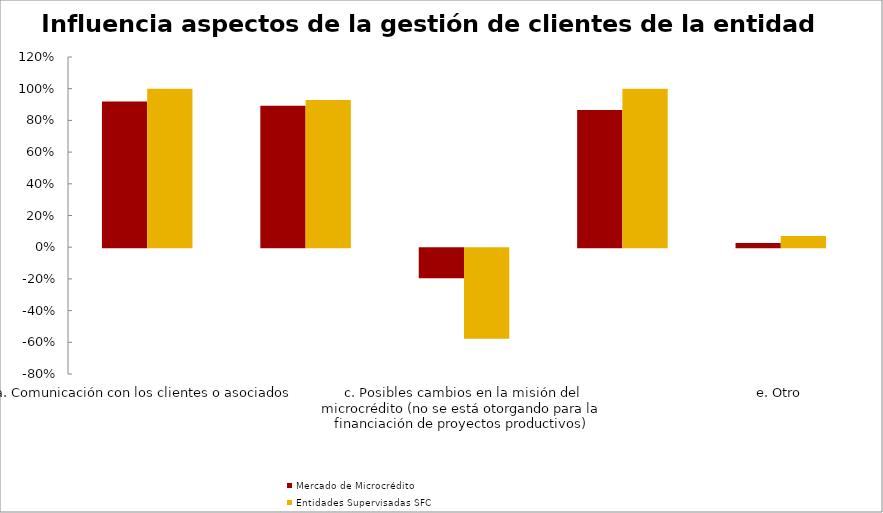
| Category | Mercado de Microcrédito | Entidades Supervisadas SFC |
|---|---|---|
| a. Comunicación con los clientes o asociados | 0.919 | 1 |
| b. Desarrollo de productos adecuados para los clientes o asociados | 0.892 | 0.929 |
| c. Posibles cambios en la misión del microcrédito (no se está otorgando para la financiación de proyectos productivos) | -0.189 | -0.571 |
| d. Apoyo del asesor de microcrédito | 0.865 | 1 |
| e. Otro | 0.027 | 0.071 |